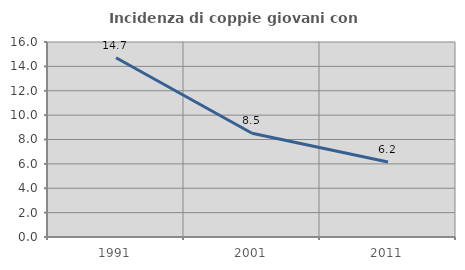
| Category | Incidenza di coppie giovani con figli |
|---|---|
| 1991.0 | 14.706 |
| 2001.0 | 8.511 |
| 2011.0 | 6.154 |